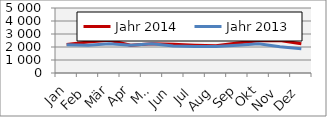
| Category | Jahr 2014 | Jahr 2013 |
|---|---|---|
| Jan | 2196.931 | 2169.188 |
| Feb | 2388.443 | 2140 |
| Mär | 2518.672 | 2246.66 |
| Apr | 2128.95 | 2138.56 |
| Mai | 2254.972 | 2240.886 |
| Jun | 2203.898 | 2076.45 |
| Jul | 2140.145 | 2045.642 |
| Aug | 2092.689 | 2030.3 |
| Sep | 2315.632 | 2133.99 |
| Okt | 2473.194 | 2253.35 |
| Nov | 2492.779 | 2027.175 |
| Dez | 2242.497 | 1859.23 |